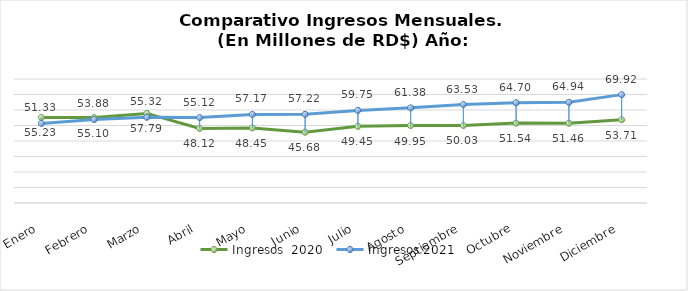
| Category | Ingresos  2020 | Ingresos 2021 |
|---|---|---|
| Enero | 55.226 | 51.329 |
| Febrero | 55.1 | 53.877 |
| Marzo | 57.79 | 55.319 |
| Abril | 48.12 | 55.124 |
| Mayo | 48.451 | 57.174 |
| Junio | 45.677 | 57.216 |
| Julio | 49.45 | 59.753 |
| Agosto | 49.952 | 61.378 |
| Septiembre | 50.032 | 63.529 |
| Octubre | 51.542 | 64.699 |
| Noviembre | 51.457 | 64.945 |
| Diciembre | 53.712 | 69.925 |